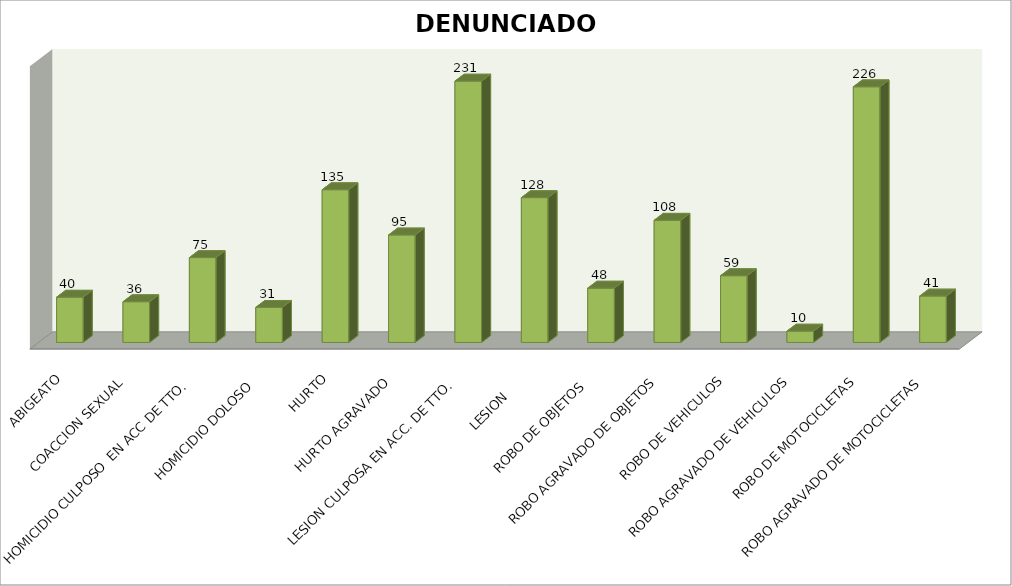
| Category | DENUNCIADOS |
|---|---|
| ABIGEATO | 40 |
| COACCION SEXUAL | 36 |
| HOMICIDIO CULPOSO  EN ACC DE TTO.  | 75 |
| HOMICIDIO DOLOSO  | 31 |
| HURTO | 135 |
| HURTO AGRAVADO | 95 |
| LESION CULPOSA EN ACC. DE TTO. | 231 |
| LESION      | 128 |
| ROBO DE OBJETOS  | 48 |
| ROBO AGRAVADO DE OBJETOS | 108 |
| ROBO DE VEHICULOS | 59 |
| ROBO AGRAVADO DE VEHICULOS | 10 |
| ROBO DE MOTOCICLETAS | 226 |
| ROBO AGRAVADO DE MOTOCICLETAS | 41 |